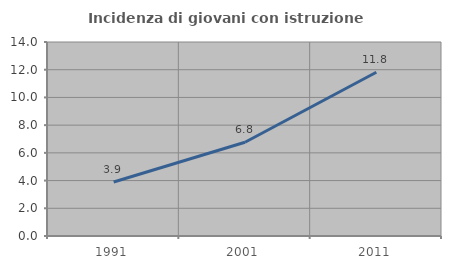
| Category | Incidenza di giovani con istruzione universitaria |
|---|---|
| 1991.0 | 3.896 |
| 2001.0 | 6.767 |
| 2011.0 | 11.818 |